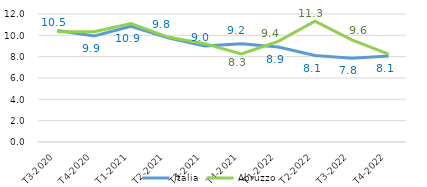
| Category | Italia | Abruzzo |
|---|---|---|
|   T3-2020 | 10.452 | 10.338 |
|   T4-2020 | 9.94 | 10.345 |
|   T1-2021 | 10.854 | 11.098 |
|   T2-2021 | 9.774 | 9.837 |
|   T3-2021 | 9.006 | 9.219 |
|   T4-2021 | 9.222 | 8.254 |
|   T1-2022 | 8.898 | 9.43 |
|   T2-2022 | 8.105 | 11.322 |
|   T3-2022 | 7.843 | 9.583 |
|   T4-2022 | 8.065 | 8.244 |